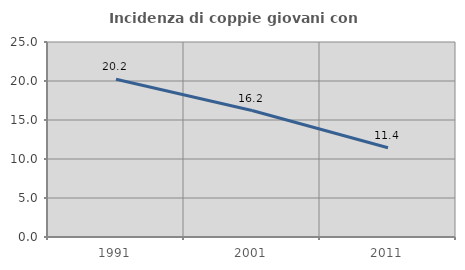
| Category | Incidenza di coppie giovani con figli |
|---|---|
| 1991.0 | 20.233 |
| 2001.0 | 16.215 |
| 2011.0 | 11.434 |